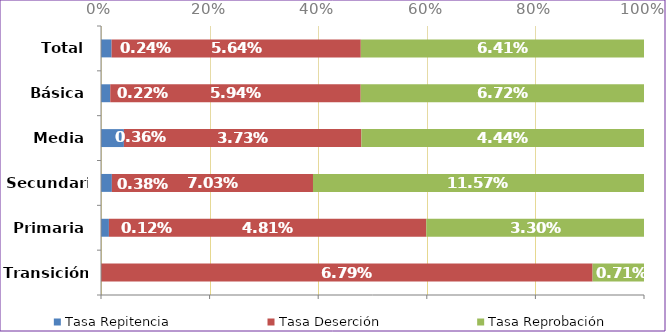
| Category | Tasa Repitencia | Tasa Deserción | Tasa Reprobación |
|---|---|---|---|
| Transición | 0 | 0.068 | 0.007 |
| Primaria | 0.001 | 0.048 | 0.033 |
| Secundaria | 0.004 | 0.07 | 0.116 |
| Media | 0.004 | 0.037 | 0.044 |
| Básica | 0.002 | 0.059 | 0.067 |
| Total | 0.002 | 0.056 | 0.064 |